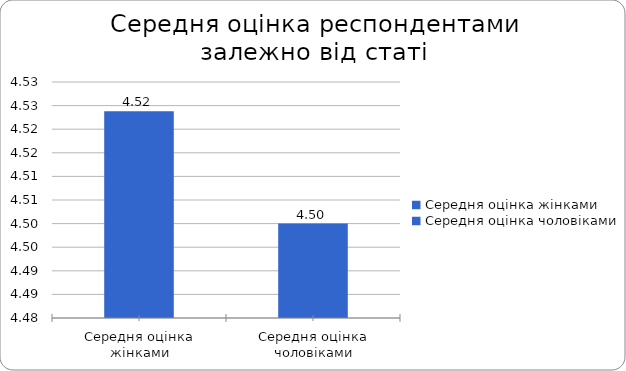
| Category | Series 0 |
|---|---|
| Середня оцінка жінками | 4.524 |
| Середня оцінка чоловіками | 4.5 |